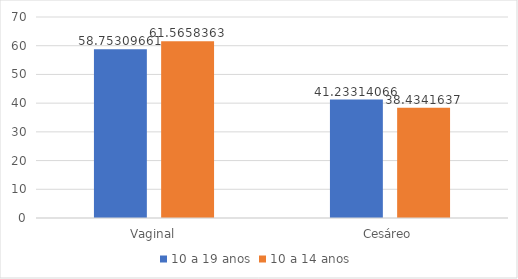
| Category | 10 a 19 anos | 10 a 14 anos  |
|---|---|---|
| Vaginal | 58.753 | 61.566 |
| Cesáreo | 41.233 | 38.434 |